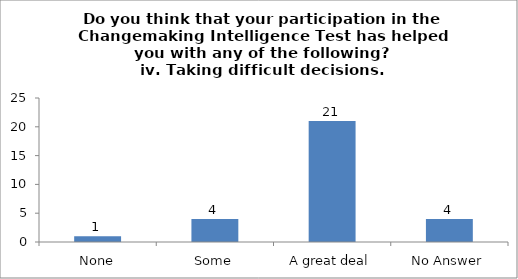
| Category | Do you think that your participation in the Changemaking Intelligence Test has helped you with any of the following?
iv. Taking difficult decisions. |
|---|---|
| None | 1 |
| Some | 4 |
| A great deal | 21 |
| No Answer | 4 |